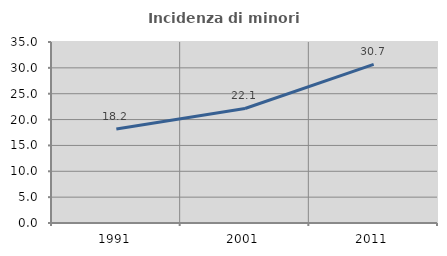
| Category | Incidenza di minori stranieri |
|---|---|
| 1991.0 | 18.182 |
| 2001.0 | 22.143 |
| 2011.0 | 30.678 |